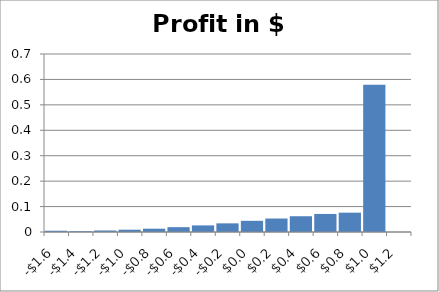
| Category | Series 0 |
|---|---|
| -1.6 | 0.005 |
| -1.4 | 0.003 |
| -1.2 | 0.006 |
| -1.0 | 0.009 |
| -0.8 | 0.013 |
| -0.6 | 0.019 |
| -0.4 | 0.026 |
| -0.2 | 0.034 |
| 0.0 | 0.044 |
| 0.2 | 0.053 |
| 0.4 | 0.062 |
| 0.6 | 0.071 |
| 0.8 | 0.076 |
| 1.0 | 0.579 |
| 1.2 | 0 |